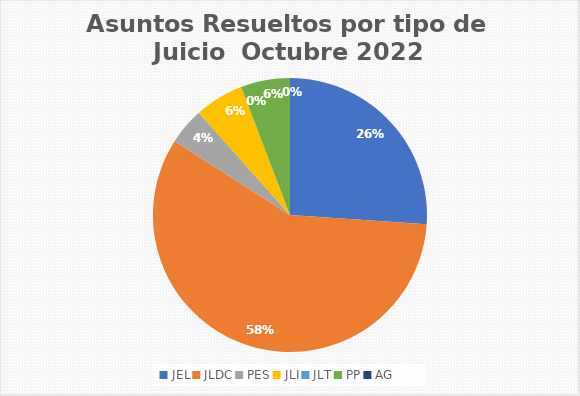
| Category | Asuntos Resueltos por tipo de Juicio  Octubre |
|---|---|
| JEL | 18 |
| JLDC | 40 |
| PES | 3 |
| JLI | 4 |
| JLT | 0 |
| PP | 4 |
| AG | 0 |